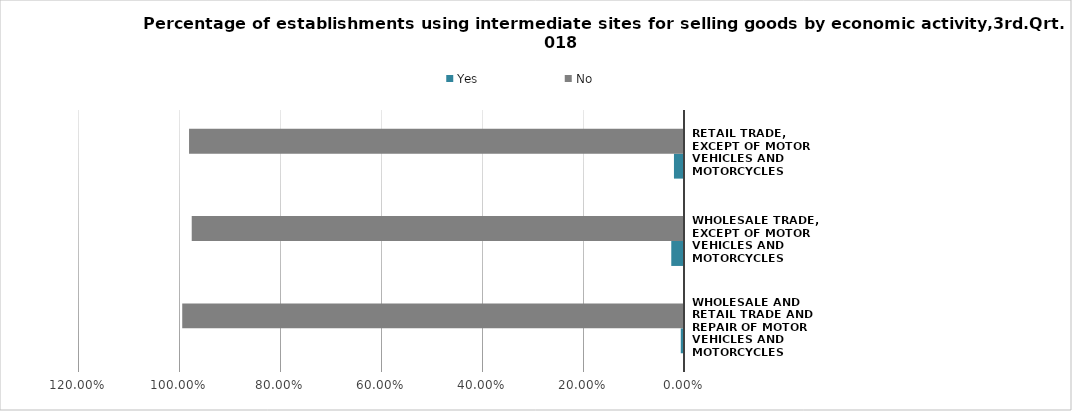
| Category | Yes | No |
|---|---|---|
| Wholesale and retail trade and repair of motor vehicles and motorcycles | 0.006 | 0.994 |
| Wholesale trade, except of motor vehicles and motorcycles | 0.025 | 0.975 |
| Retail trade, except of motor vehicles and motorcycles | 0.02 | 0.98 |